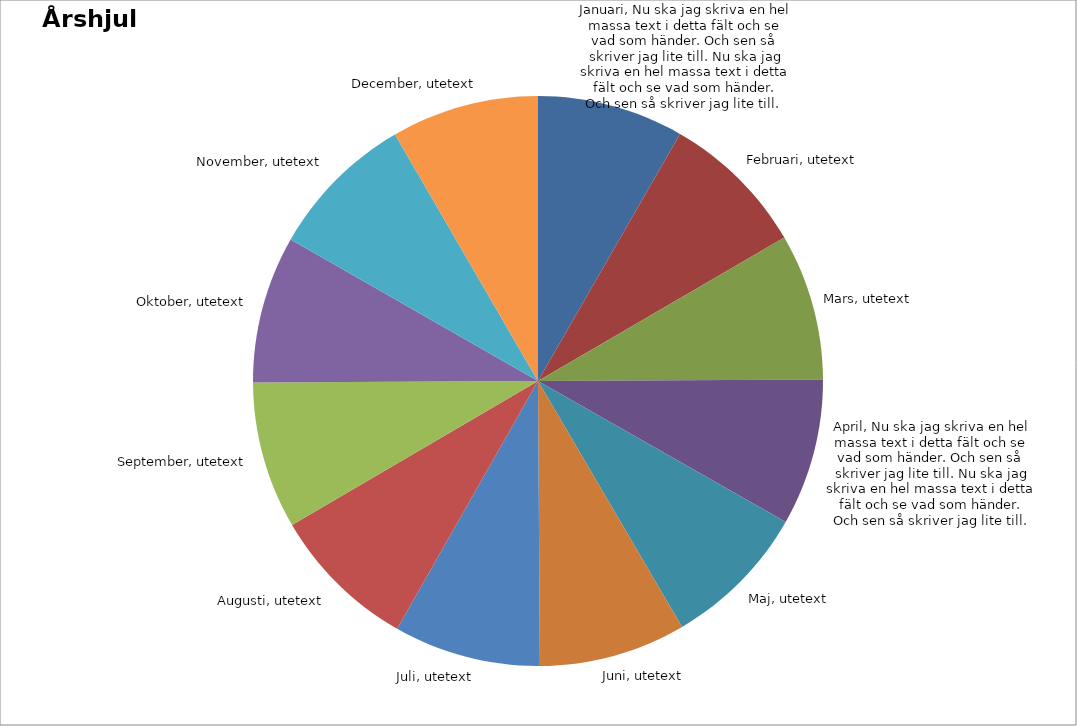
| Category | Period |
|---|---|
| 0 | 2017-01-01 |
| 1 | 2017-02-01 |
| 2 | 2017-03-01 |
| 3 | 2017-04-01 |
| 4 | 2017-05-01 |
| 5 | 2017-06-01 |
| 6 | 2017-07-01 |
| 7 | 2017-08-01 |
| 8 | 2017-09-01 |
| 9 | 2017-10-01 |
| 10 | 2017-11-01 |
| 11 | 2017-12-01 |